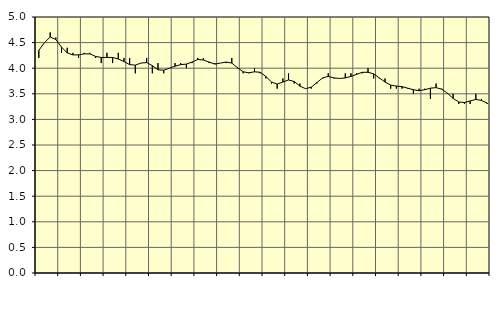
| Category | Piggar | Jordbruk, skogsbruk o fiske, SNI 01-03 |
|---|---|---|
| nan | 4.2 | 4.35 |
| 1.0 | 4.5 | 4.5 |
| 1.0 | 4.7 | 4.61 |
| 1.0 | 4.6 | 4.56 |
| nan | 4.3 | 4.41 |
| 2.0 | 4.4 | 4.3 |
| 2.0 | 4.3 | 4.26 |
| 2.0 | 4.2 | 4.26 |
| nan | 4.3 | 4.28 |
| 3.0 | 4.3 | 4.28 |
| 3.0 | 4.2 | 4.23 |
| 3.0 | 4.1 | 4.21 |
| nan | 4.3 | 4.21 |
| 4.0 | 4.1 | 4.21 |
| 4.0 | 4.3 | 4.18 |
| 4.0 | 4.2 | 4.13 |
| nan | 4.2 | 4.07 |
| 5.0 | 3.9 | 4.06 |
| 5.0 | 4.1 | 4.1 |
| 5.0 | 4.2 | 4.11 |
| nan | 3.9 | 4.05 |
| 6.0 | 4.1 | 3.97 |
| 6.0 | 3.9 | 3.96 |
| 6.0 | 4 | 4 |
| nan | 4.1 | 4.04 |
| 7.0 | 4.1 | 4.07 |
| 7.0 | 4 | 4.08 |
| 7.0 | 4.1 | 4.12 |
| nan | 4.2 | 4.17 |
| 8.0 | 4.2 | 4.16 |
| 8.0 | 4.1 | 4.12 |
| 8.0 | 4.1 | 4.08 |
| nan | 4.1 | 4.1 |
| 9.0 | 4.1 | 4.12 |
| 9.0 | 4.2 | 4.1 |
| 9.0 | 4 | 4.01 |
| nan | 3.9 | 3.93 |
| 10.0 | 3.9 | 3.91 |
| 10.0 | 4 | 3.93 |
| 10.0 | 3.9 | 3.92 |
| nan | 3.8 | 3.84 |
| 11.0 | 3.7 | 3.73 |
| 11.0 | 3.6 | 3.69 |
| 11.0 | 3.8 | 3.73 |
| nan | 3.9 | 3.77 |
| 12.0 | 3.7 | 3.74 |
| 12.0 | 3.7 | 3.65 |
| 12.0 | 3.6 | 3.6 |
| nan | 3.6 | 3.63 |
| 13.0 | 3.7 | 3.72 |
| 13.0 | 3.8 | 3.81 |
| 13.0 | 3.9 | 3.84 |
| nan | 3.8 | 3.81 |
| 14.0 | 3.8 | 3.8 |
| 14.0 | 3.9 | 3.81 |
| 14.0 | 3.9 | 3.84 |
| nan | 3.9 | 3.88 |
| 15.0 | 3.9 | 3.92 |
| 15.0 | 4 | 3.92 |
| 15.0 | 3.8 | 3.89 |
| nan | 3.8 | 3.81 |
| 16.0 | 3.8 | 3.73 |
| 16.0 | 3.6 | 3.67 |
| 16.0 | 3.6 | 3.65 |
| nan | 3.6 | 3.64 |
| 17.0 | 3.6 | 3.61 |
| 17.0 | 3.5 | 3.58 |
| 17.0 | 3.6 | 3.56 |
| nan | 3.6 | 3.58 |
| 18.0 | 3.4 | 3.61 |
| 18.0 | 3.7 | 3.62 |
| 18.0 | 3.6 | 3.59 |
| nan | 3.5 | 3.51 |
| 19.0 | 3.5 | 3.41 |
| 19.0 | 3.3 | 3.34 |
| 19.0 | 3.3 | 3.33 |
| nan | 3.3 | 3.36 |
| 20.0 | 3.5 | 3.39 |
| 20.0 | 3.4 | 3.37 |
| 20.0 | 3.3 | 3.32 |